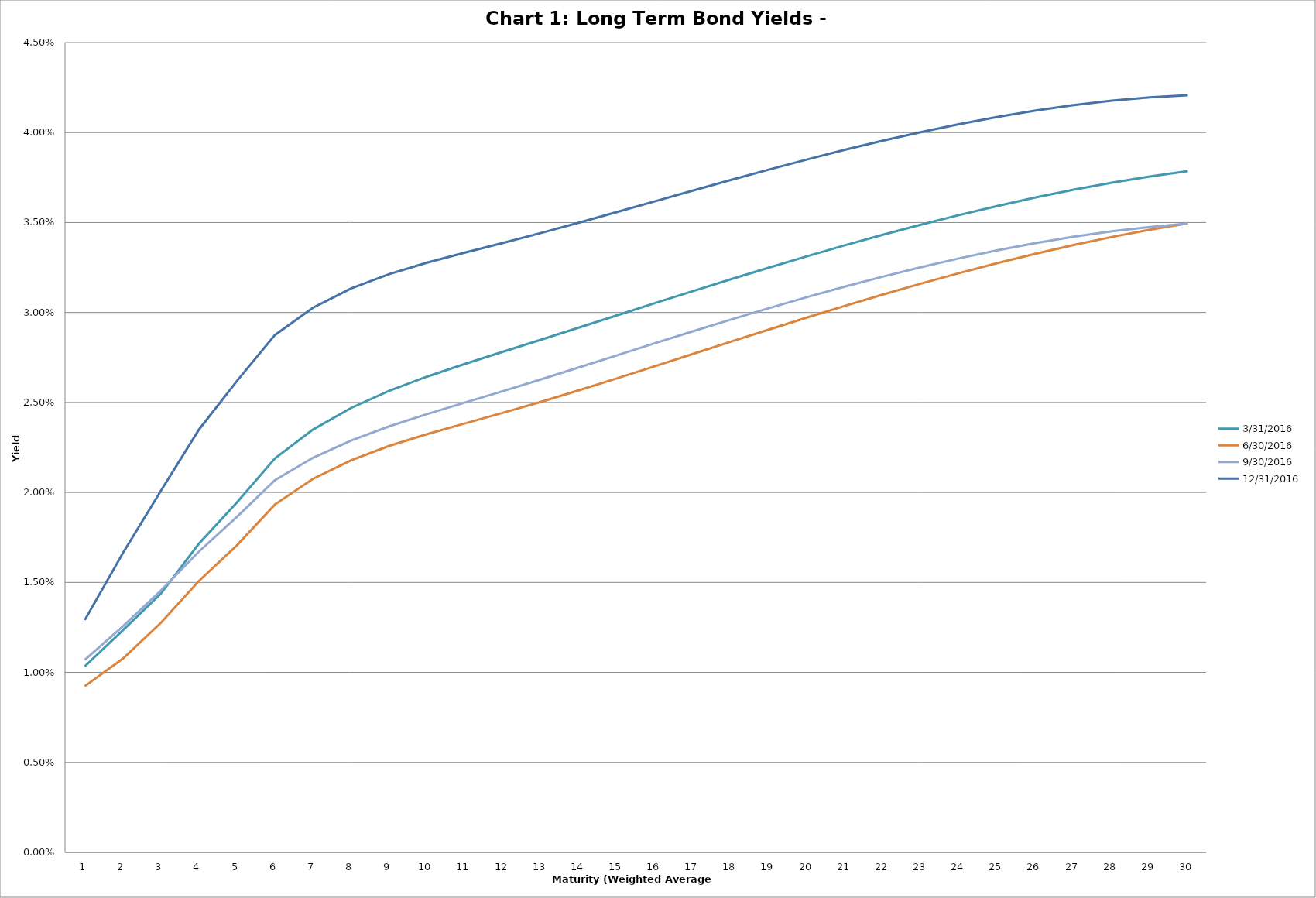
| Category | 3/31/2016 | 6/30/2016 | 9/30/2016 | 12/31/2016 |
|---|---|---|---|---|
| 0 | 0.01 | 0.009 | 0.011 | 0.013 |
| 1 | 0.012 | 0.011 | 0.013 | 0.017 |
| 2 | 0.014 | 0.013 | 0.015 | 0.02 |
| 3 | 0.017 | 0.015 | 0.017 | 0.023 |
| 4 | 0.019 | 0.017 | 0.019 | 0.026 |
| 5 | 0.022 | 0.019 | 0.021 | 0.029 |
| 6 | 0.023 | 0.021 | 0.022 | 0.03 |
| 7 | 0.025 | 0.022 | 0.023 | 0.031 |
| 8 | 0.026 | 0.023 | 0.024 | 0.032 |
| 9 | 0.026 | 0.023 | 0.024 | 0.033 |
| 10 | 0.027 | 0.024 | 0.025 | 0.033 |
| 11 | 0.028 | 0.024 | 0.026 | 0.034 |
| 12 | 0.028 | 0.025 | 0.026 | 0.034 |
| 13 | 0.029 | 0.026 | 0.027 | 0.035 |
| 14 | 0.03 | 0.026 | 0.028 | 0.036 |
| 15 | 0.031 | 0.027 | 0.028 | 0.036 |
| 16 | 0.031 | 0.028 | 0.029 | 0.037 |
| 17 | 0.032 | 0.028 | 0.03 | 0.037 |
| 18 | 0.033 | 0.029 | 0.03 | 0.038 |
| 19 | 0.033 | 0.03 | 0.031 | 0.039 |
| 20 | 0.034 | 0.03 | 0.031 | 0.039 |
| 21 | 0.034 | 0.031 | 0.032 | 0.04 |
| 22 | 0.035 | 0.032 | 0.033 | 0.04 |
| 23 | 0.035 | 0.032 | 0.033 | 0.04 |
| 24 | 0.036 | 0.033 | 0.033 | 0.041 |
| 25 | 0.036 | 0.033 | 0.034 | 0.041 |
| 26 | 0.037 | 0.034 | 0.034 | 0.042 |
| 27 | 0.037 | 0.034 | 0.035 | 0.042 |
| 28 | 0.038 | 0.035 | 0.035 | 0.042 |
| 29 | 0.038 | 0.035 | 0.035 | 0.042 |